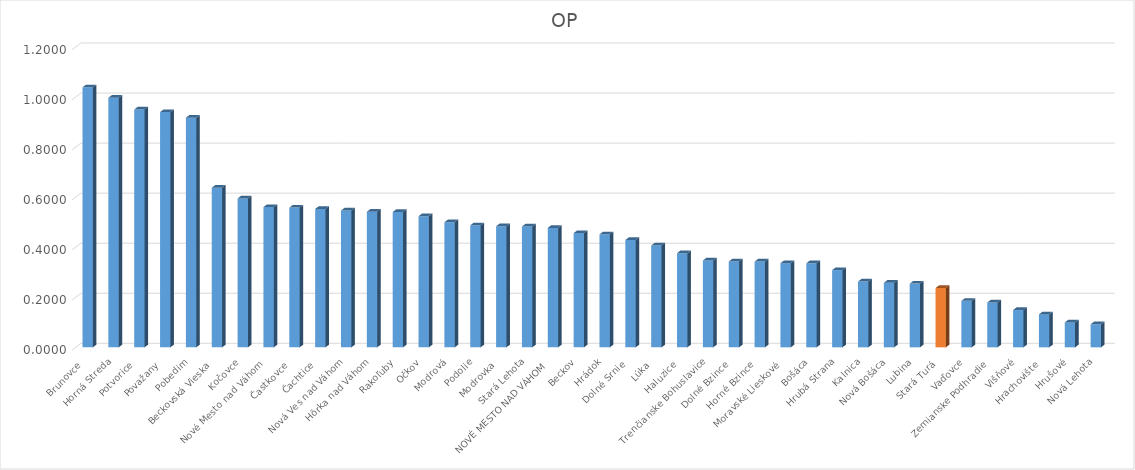
| Category | OP |
|---|---|
| Brunovce | 1.039 |
| Horná Streda | 0.997 |
| Potvorice | 0.95 |
| Považany | 0.94 |
| Pobedim | 0.918 |
| Beckovská Vieska | 0.638 |
| Kočovce | 0.595 |
| Nové Mesto nad Váhom | 0.56 |
| Častkovce | 0.558 |
| Čachtice | 0.553 |
| Nová Ves nad Váhom | 0.547 |
| Hôrka nad Váhom | 0.542 |
| Rakoľuby | 0.541 |
| Očkov | 0.524 |
| Modrová | 0.5 |
| Podolie | 0.488 |
| Modrovka | 0.484 |
| Stará Lehota | 0.483 |
| NOVÉ MESTO NAD VÁHOM | 0.477 |
| Beckov | 0.456 |
| Hrádok | 0.451 |
| Dolné Srnie | 0.429 |
| Lúka | 0.407 |
| Haluzice | 0.376 |
| Trenčianske Bohuslavice | 0.347 |
| Dolné Bzince | 0.343 |
| Horné Bzince | 0.343 |
| Moravské Lieskové | 0.336 |
| Bošáca | 0.336 |
| Hrubá Strana | 0.309 |
| Kalnica | 0.263 |
| Nová Bošáca | 0.258 |
| Lubina | 0.255 |
| Stará Turá | 0.237 |
| Vaďovce | 0.186 |
| Zemianske Podhradie | 0.179 |
| Višňové | 0.149 |
| Hrachovište | 0.132 |
| Hrušové | 0.1 |
| Nová Lehota | 0.092 |